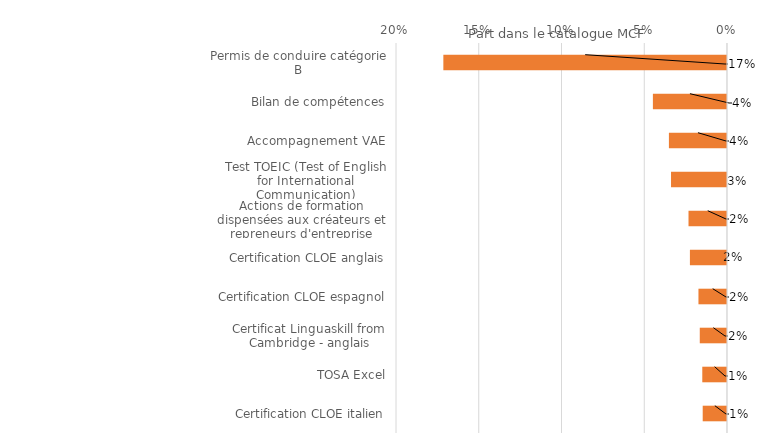
| Category | Series 0 |
|---|---|
| Permis de conduire catégorie B | 0.171 |
| Bilan de compétences | 0.045 |
| Accompagnement VAE | 0.035 |
| Test TOEIC (Test of English for International Communication) | 0.034 |
| Actions de formation dispensées aux créateurs et repreneurs d'entreprise | 0.023 |
| Certification CLOE anglais | 0.022 |
| Certification CLOE espagnol | 0.017 |
| Certificat Linguaskill from Cambridge - anglais | 0.016 |
| TOSA Excel | 0.015 |
| Certification CLOE italien | 0.015 |